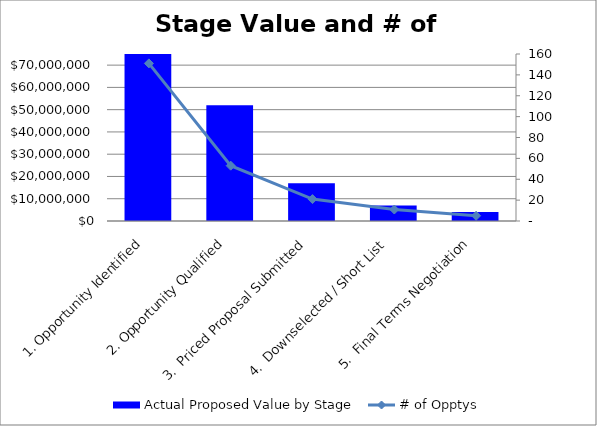
| Category | Actual Proposed Value by Stage |
|---|---|
| 1. Opportunity Identified | 115000000 |
| 2. Opportunity Qualified | 52000000 |
| 3.  Priced Proposal Submitted | 17000000 |
| 4.  Downselected / Short List | 7000000 |
| 5.  Final Terms Negotiation | 4000000 |